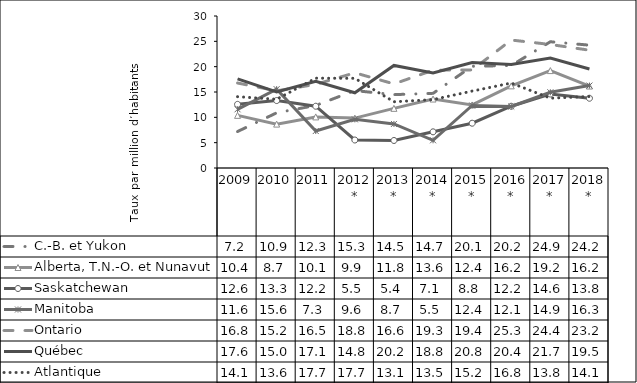
| Category | C.-B. et Yukon | Alberta, T.N.-O. et Nunavut | Saskatchewan | Manitoba | Ontario | Québec | Atlantique |
|---|---|---|---|---|---|---|---|
| 2009 | 7.2 | 10.387 | 12.563 | 11.584 | 16.772 | 17.594 | 14.074 |
| 2010 | 10.888 | 8.663 | 13.315 | 15.562 | 15.226 | 15.008 | 13.566 |
| 2011 | 12.35 | 10.083 | 12.191 | 7.295 | 16.511 | 17.109 | 17.728 |
| 2012* | 15.276 | 9.851 | 5.525 | 9.598 | 18.787 | 14.841 | 17.697 |
| 2013* | 14.482 | 11.773 | 5.431 | 8.692 | 16.598 | 20.242 | 13.073 |
| 2014* | 14.733 | 13.609 | 7.139 | 5.465 | 19.298 | 18.756 | 13.495 |
| 2015* | 20.076 | 12.446 | 8.841 | 12.351 | 19.362 | 20.836 | 15.183 |
| 2016* | 20.226 | 16.211 | 12.189 | 12.139 | 25.257 | 20.428 | 16.766 |
| 2017* | 24.92 | 19.228 | 14.606 | 14.946 | 24.378 | 21.682 | 13.782 |
| 2018* | 24.244 | 16.173 | 13.769 | 16.27 | 23.25 | 19.546 | 14.113 |